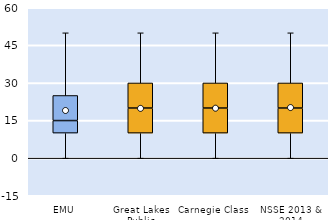
| Category | 25th | 50th | 75th |
|---|---|---|---|
| EMU | 10 | 5 | 10 |
| Great Lakes Public | 10 | 10 | 10 |
| Carnegie Class | 10 | 10 | 10 |
| NSSE 2013 & 2014 | 10 | 10 | 10 |